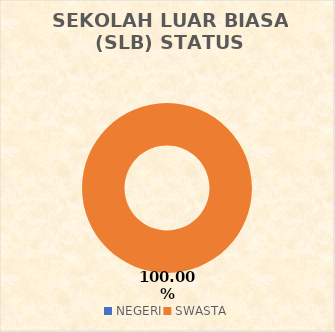
| Category | SEKOLAH LUAR BIASA (SLB) STATUS SEKOLAH |
|---|---|
| NEGERI | 0 |
| SWASTA | 2 |